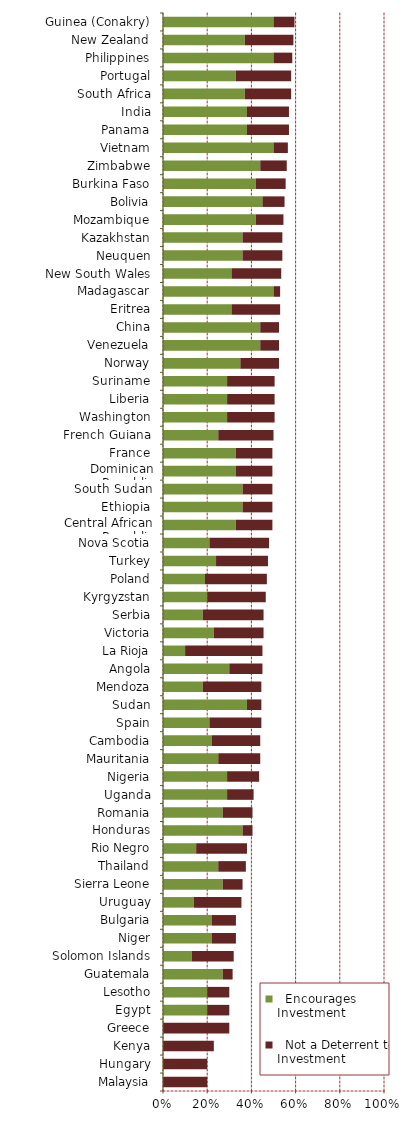
| Category |   Encourages Investment |   Not a Deterrent to Investment |
|---|---|---|
| Malaysia | 0 | 0.2 |
| Hungary | 0 | 0.2 |
| Kenya | 0 | 0.23 |
| Greece | 0 | 0.3 |
| Egypt | 0.2 | 0.1 |
| Lesotho | 0.2 | 0.1 |
| Guatemala | 0.27 | 0.045 |
| Solomon Islands | 0.13 | 0.19 |
| Niger | 0.22 | 0.11 |
| Bulgaria | 0.22 | 0.11 |
| Uruguay | 0.14 | 0.215 |
| Sierra Leone | 0.27 | 0.09 |
| Thailand | 0.25 | 0.125 |
| Rio Negro | 0.15 | 0.23 |
| Honduras | 0.36 | 0.045 |
| Romania | 0.27 | 0.135 |
| Uganda | 0.29 | 0.12 |
| Nigeria | 0.29 | 0.145 |
| Mauritania | 0.25 | 0.19 |
| Cambodia | 0.22 | 0.22 |
| Spain | 0.21 | 0.235 |
| Sudan | 0.38 | 0.065 |
| Mendoza | 0.18 | 0.265 |
| Angola | 0.3 | 0.15 |
| La Rioja | 0.1 | 0.35 |
| Victoria | 0.23 | 0.225 |
| Serbia | 0.18 | 0.275 |
| Kyrgyzstan | 0.2 | 0.265 |
| Poland | 0.19 | 0.28 |
| Turkey | 0.24 | 0.235 |
| Nova Scotia | 0.21 | 0.27 |
| Central African Republic | 0.33 | 0.165 |
| Ethiopia | 0.36 | 0.135 |
| South Sudan | 0.36 | 0.135 |
| Dominican Republic | 0.33 | 0.165 |
| France | 0.33 | 0.165 |
| French Guiana | 0.25 | 0.25 |
| Washington | 0.29 | 0.215 |
| Liberia | 0.29 | 0.215 |
| Suriname | 0.29 | 0.215 |
| Norway | 0.35 | 0.175 |
| Venezuela | 0.44 | 0.085 |
| China | 0.44 | 0.085 |
| Eritrea | 0.31 | 0.22 |
| Madagascar | 0.5 | 0.03 |
| New South Wales | 0.31 | 0.225 |
| Neuquen | 0.36 | 0.18 |
| Kazakhstan | 0.36 | 0.18 |
| Mozambique | 0.42 | 0.125 |
| Bolivia | 0.45 | 0.1 |
| Burkina Faso | 0.42 | 0.135 |
| Zimbabwe | 0.44 | 0.12 |
| Vietnam | 0.5 | 0.065 |
| Panama | 0.38 | 0.19 |
| India | 0.38 | 0.19 |
| South Africa | 0.37 | 0.21 |
| Portugal | 0.33 | 0.25 |
| Philippines | 0.5 | 0.085 |
| New Zealand | 0.37 | 0.22 |
| Guinea (Conakry) | 0.5 | 0.095 |